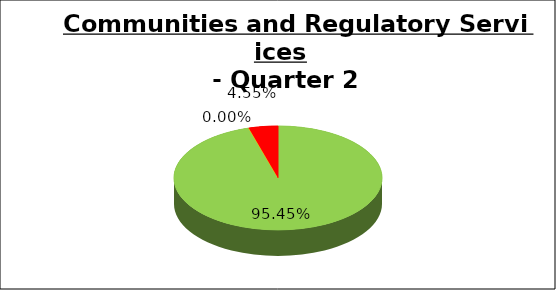
| Category | Q2 |
|---|---|
| Green | 0.955 |
| Amber | 0 |
| Red | 0.045 |